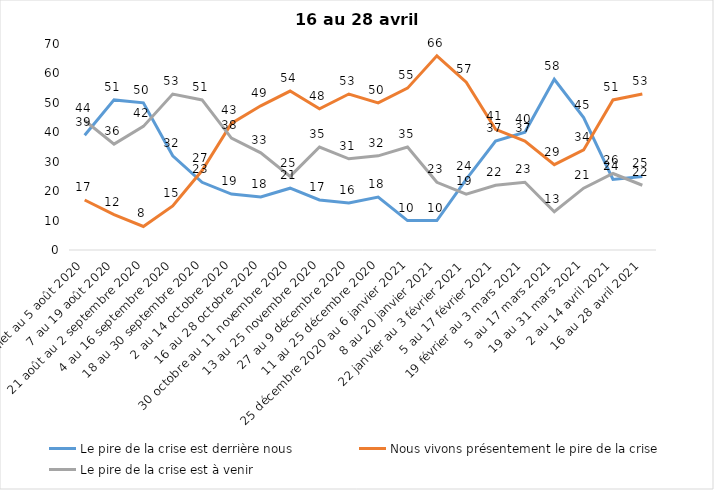
| Category | Le pire de la crise est derrière nous | Nous vivons présentement le pire de la crise | Le pire de la crise est à venir |
|---|---|---|---|
| 24 juillet au 5 août 2020 | 39 | 17 | 44 |
| 7 au 19 août 2020 | 51 | 12 | 36 |
| 21 août au 2 septembre 2020 | 50 | 8 | 42 |
| 4 au 16 septembre 2020 | 32 | 15 | 53 |
| 18 au 30 septembre 2020 | 23 | 27 | 51 |
| 2 au 14 octobre 2020 | 19 | 43 | 38 |
| 16 au 28 octobre 2020 | 18 | 49 | 33 |
| 30 octobre au 11 novembre 2020 | 21 | 54 | 25 |
| 13 au 25 novembre 2020 | 17 | 48 | 35 |
| 27 au 9 décembre 2020 | 16 | 53 | 31 |
| 11 au 25 décembre 2020 | 18 | 50 | 32 |
| 25 décembre 2020 au 6 janvier 2021 | 10 | 55 | 35 |
| 8 au 20 janvier 2021 | 10 | 66 | 23 |
| 22 janvier au 3 février 2021 | 24 | 57 | 19 |
| 5 au 17 février 2021 | 37 | 41 | 22 |
| 19 février au 3 mars 2021 | 40 | 37 | 23 |
| 5 au 17 mars 2021 | 58 | 29 | 13 |
| 19 au 31 mars 2021 | 45 | 34 | 21 |
| 2 au 14 avril 2021 | 24 | 51 | 26 |
| 16 au 28 avril 2021 | 25 | 53 | 22 |